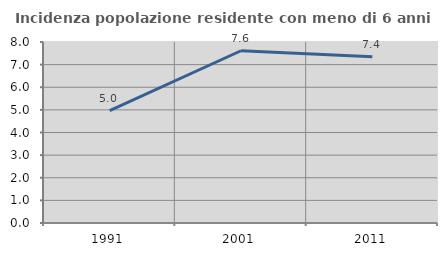
| Category | Incidenza popolazione residente con meno di 6 anni |
|---|---|
| 1991.0 | 4.97 |
| 2001.0 | 7.613 |
| 2011.0 | 7.35 |